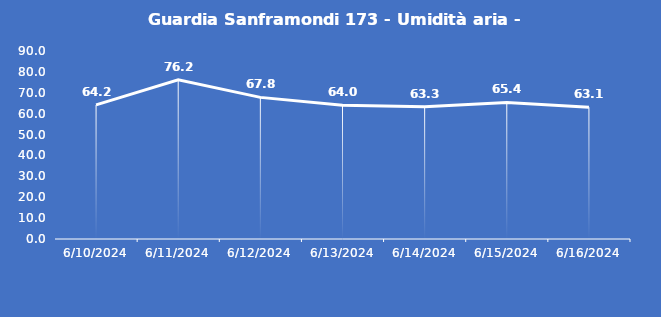
| Category | Guardia Sanframondi 173 - Umidità aria - Grezzo (%) |
|---|---|
| 6/10/24 | 64.2 |
| 6/11/24 | 76.2 |
| 6/12/24 | 67.8 |
| 6/13/24 | 64 |
| 6/14/24 | 63.3 |
| 6/15/24 | 65.4 |
| 6/16/24 | 63.1 |